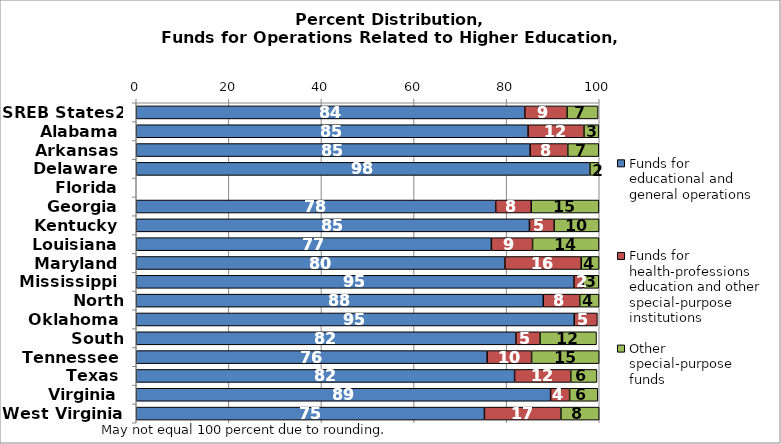
| Category | Funds for educational and general operations | Funds for health-professions education and other special-purpose institutions | Other special-purpose funds |
|---|---|---|---|
| SREB States2 | 83.921 | 9.124 | 6.696 |
| Alabama | 84.625 | 12.077 | 3.187 |
| Arkansas | 85.065 | 8.141 | 6.687 |
| Delaware | 97.989 | 0 | 1.88 |
| Florida | 0 | 0 | 0 |
| Georgia | 77.636 | 7.678 | 14.611 |
| Kentucky | 84.923 | 5.33 | 9.697 |
| Louisiana | 76.703 | 8.894 | 14.343 |
| Maryland | 79.629 | 16.477 | 3.846 |
| Mississippi | 94.529 | 2.038 | 3.337 |
| North Carolina | 87.91 | 7.879 | 4.158 |
| Oklahoma | 94.6 | 5.002 | 0 |
| South Carolina | 82.004 | 5.2 | 12.2 |
| Tennessee | 75.78 | 9.61 | 14.591 |
| Texas | 81.716 | 12.136 | 5.654 |
| Virginia | 89.489 | 4.118 | 6.089 |
| West Virginia | 75.204 | 16.517 | 8.262 |